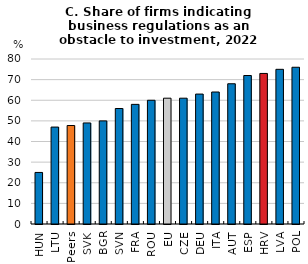
| Category | Business regulations |
|---|---|
| HUN | 25 |
| LTU | 47 |
| Peers | 47.75 |
| SVK | 49 |
| BGR | 50 |
| SVN | 56 |
| FRA | 58 |
| ROU | 60 |
| EU | 61 |
| CZE | 61 |
| DEU | 63 |
| ITA | 64 |
| AUT | 68 |
| ESP | 72 |
| HRV | 73 |
| LVA | 75 |
| POL | 76 |